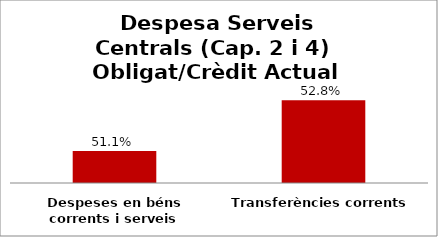
| Category | Series 0 |
|---|---|
| Despeses en béns corrents i serveis | 0.511 |
| Transferències corrents | 0.528 |